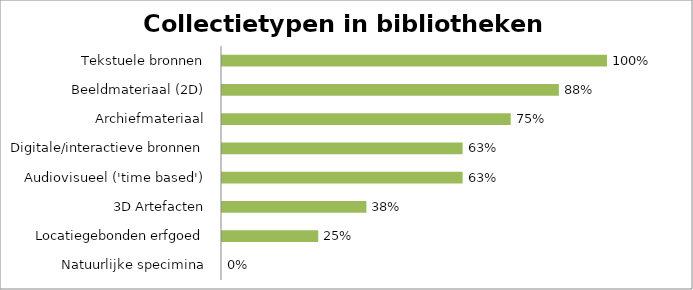
| Category | Bibliotheken (n=8) |
|---|---|
| Natuurlijke specimina | 0 |
| Locatiegebonden erfgoed | 0.25 |
| 3D Artefacten | 0.375 |
| Audiovisueel ('time based') | 0.625 |
| Digitale/interactieve bronnen | 0.625 |
| Archiefmateriaal | 0.75 |
| Beeldmateriaal (2D) | 0.875 |
| Tekstuele bronnen | 1 |